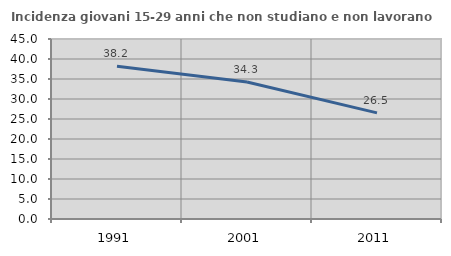
| Category | Incidenza giovani 15-29 anni che non studiano e non lavorano  |
|---|---|
| 1991.0 | 38.188 |
| 2001.0 | 34.263 |
| 2011.0 | 26.535 |